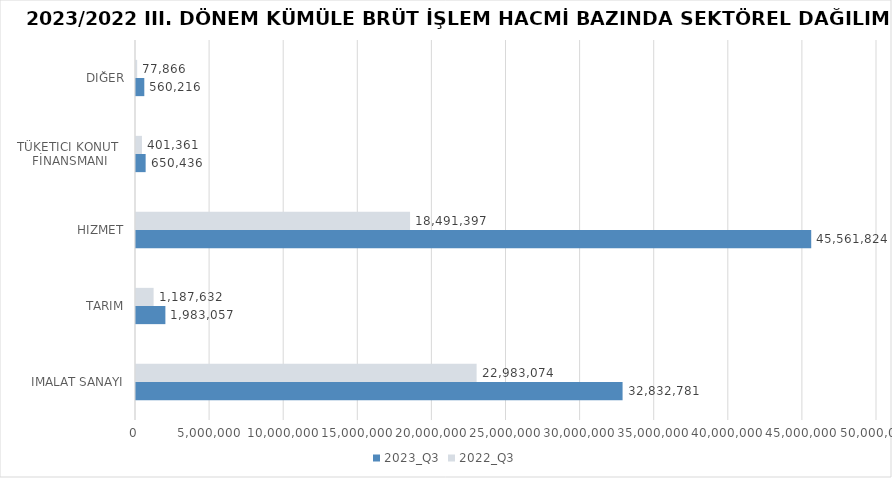
| Category | 2023_Q3 | 2022_Q3 |
|---|---|---|
| İMALAT SANAYİ | 32832780.57 | 22983073.606 |
| TARIM | 1983056.96 | 1187632.025 |
| HİZMET | 45561823.588 | 18491397.437 |
| TÜKETİCİ KONUT 
FİNANSMANI | 650436 | 401361 |
| DİĞER | 560216 | 77866 |